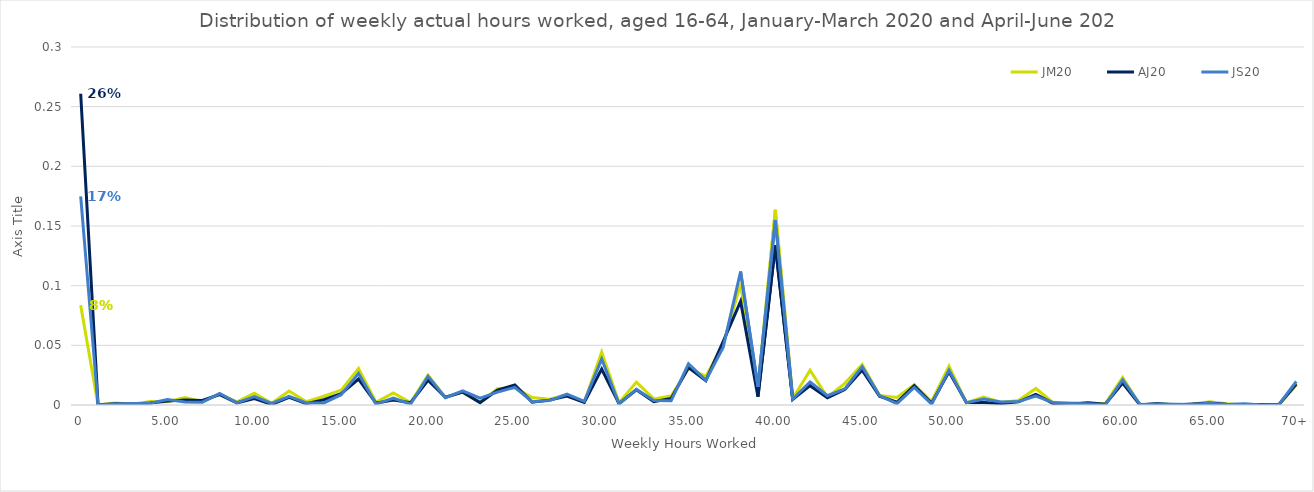
| Category | JM20 | AJ20 | JS20 |
|---|---|---|---|
| 0 | 0.084 | 0.261 | 0.175 |
| 1 | 0 | 0 | 0 |
| 2.00 | 0.002 | 0.001 | 0.001 |
| 3.00 | 0.001 | 0.001 | 0.001 |
| 4.00 | 0.003 | 0.002 | 0.002 |
| 5.00 | 0.003 | 0.003 | 0.005 |
| 6.00 | 0.006 | 0.004 | 0.002 |
| 7.00 | 0.003 | 0.004 | 0.002 |
| 8.00 | 0.009 | 0.009 | 0.01 |
| 9.00 | 0.003 | 0.002 | 0.002 |
| 10.00 | 0.01 | 0.005 | 0.007 |
| 11.00 | 0.001 | 0.001 | 0.001 |
| 12.00 | 0.012 | 0.006 | 0.007 |
| 13.00 | 0.003 | 0.001 | 0.002 |
| 14.00 | 0.007 | 0.004 | 0.002 |
| 15.00 | 0.013 | 0.009 | 0.009 |
| 16.00 | 0.031 | 0.022 | 0.026 |
| 17.00 | 0.002 | 0.001 | 0.001 |
| 18.00 | 0.01 | 0.004 | 0.006 |
| 19.00 | 0.002 | 0.002 | 0.001 |
| 20.00 | 0.025 | 0.021 | 0.024 |
| 21.00 | 0.006 | 0.006 | 0.006 |
| 22.00 | 0.011 | 0.011 | 0.012 |
| 23.00 | 0.002 | 0.002 | 0.006 |
| 24.00 | 0.014 | 0.013 | 0.011 |
| 25.00 | 0.014 | 0.017 | 0.015 |
| 26.00 | 0.006 | 0.002 | 0.003 |
| 27.00 | 0.005 | 0.004 | 0.004 |
| 28.00 | 0.009 | 0.008 | 0.009 |
| 29.00 | 0.002 | 0.002 | 0.003 |
| 30.00 | 0.044 | 0.03 | 0.038 |
| 31.00 | 0.002 | 0.001 | 0.001 |
| 32.00 | 0.019 | 0.013 | 0.013 |
| 33.00 | 0.005 | 0.003 | 0.004 |
| 34.00 | 0.008 | 0.006 | 0.003 |
| 35.00 | 0.031 | 0.031 | 0.035 |
| 36.00 | 0.024 | 0.02 | 0.021 |
| 37.00 | 0.051 | 0.053 | 0.048 |
| 38.00 | 0.102 | 0.087 | 0.112 |
| 39.00 | 0.013 | 0.007 | 0.015 |
| 40.00 | 0.164 | 0.134 | 0.155 |
| 41.00 | 0.005 | 0.005 | 0.005 |
| 42.00 | 0.029 | 0.016 | 0.019 |
| 43.00 | 0.006 | 0.006 | 0.008 |
| 44.00 | 0.018 | 0.013 | 0.013 |
| 45.00 | 0.034 | 0.029 | 0.032 |
| 46.00 | 0.008 | 0.007 | 0.008 |
| 47.00 | 0.006 | 0.002 | 0.001 |
| 48.00 | 0.017 | 0.016 | 0.015 |
| 49.00 | 0.003 | 0.001 | 0.001 |
| 50.00 | 0.033 | 0.028 | 0.029 |
| 51.00 | 0.002 | 0.002 | 0.002 |
| 52.00 | 0.007 | 0.002 | 0.005 |
| 53.00 | 0.002 | 0.001 | 0.003 |
| 54.00 | 0.004 | 0.003 | 0.003 |
| 55.00 | 0.014 | 0.009 | 0.007 |
| 56.00 | 0.002 | 0.001 | 0.002 |
| 57.00 | 0.002 | 0.001 | 0.001 |
| 58.00 | 0.002 | 0.002 | 0.001 |
| 59.00 | 0.001 | 0.001 | 0 |
| 60.00 | 0.023 | 0.018 | 0.021 |
| 61 | 0 | 0 | 0 |
| 62.00 | 0.001 | 0.001 | 0.001 |
| 63 | 0 | 0 | 0.001 |
| 64.00 | 0.001 | 0.001 | 0.001 |
| 65.00 | 0.003 | 0.002 | 0.001 |
| 66.00 | 0.001 | 0.001 | 0 |
| 67 | 0 | 0 | 0.001 |
| 68 | 0 | 0 | 0 |
| 69.00 | 0 | 0 | 0 |
| 70+ | 0.017 | 0.018 | 0.02 |